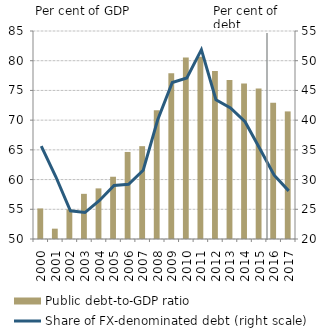
| Category | Public debt-to-GDP ratio |
|---|---|
| 2000.0 | 55.141 |
| 2001.0 | 51.739 |
| 2002.0 | 54.99 |
| 2003.0 | 57.6 |
| 2004.0 | 58.518 |
| 2005.0 | 60.476 |
| 2006.0 | 64.648 |
| 2007.0 | 65.621 |
| 2008.0 | 71.655 |
| 2009.0 | 77.878 |
| 2010.0 | 80.522 |
| 2011.0 | 80.679 |
| 2012.0 | 78.275 |
| 2013.0 | 76.773 |
| 2014.0 | 76.179 |
| 2015.0 | 75.324 |
| 2016.0 | 72.926 |
| 2017.0 | 71.47 |